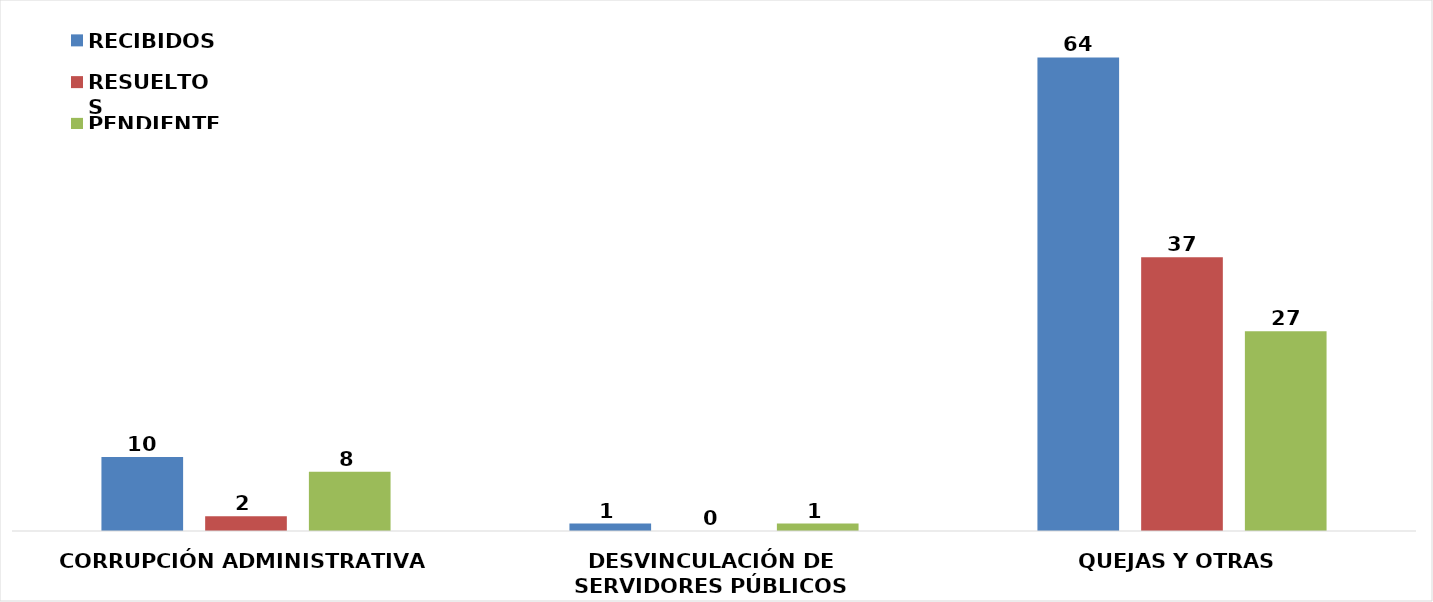
| Category | RECIBIDOS | RESUELTOS  | PENDIENTES |
|---|---|---|---|
| CORRUPCIÓN ADMINISTRATIVA | 10 | 2 | 8 |
| DESVINCULACIÓN DE SERVIDORES PÚBLICOS | 1 | 0 | 1 |
| QUEJAS Y OTRAS | 64 | 37 | 27 |